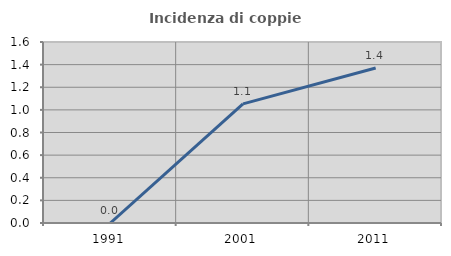
| Category | Incidenza di coppie miste |
|---|---|
| 1991.0 | 0 |
| 2001.0 | 1.053 |
| 2011.0 | 1.37 |